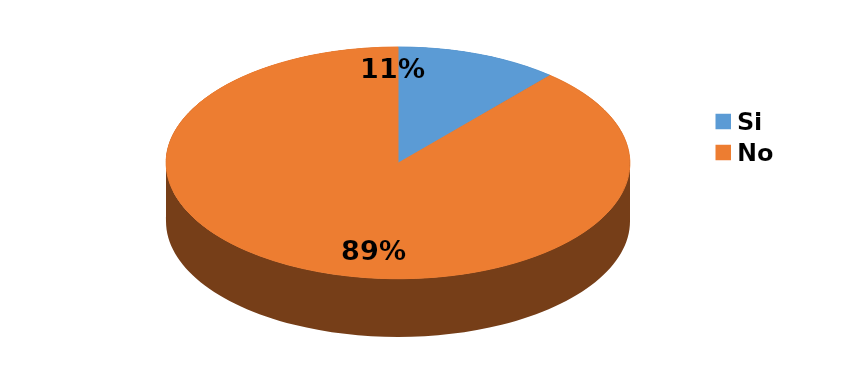
| Category | Series 0 |
|---|---|
| Si  | 17 |
| No | 133 |